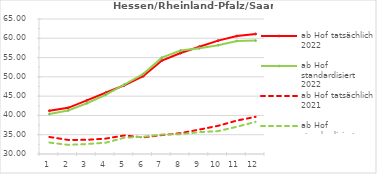
| Category | ab Hof tatsächlich 2022 | ab Hof standardisiert 2022 | ab Hof tatsächlich 2021 | ab Hof standardisiert 2021 |
|---|---|---|---|---|
| 0 | 41.209 | 40.362 | 34.411 | 32.971 |
| 1 | 41.971 | 41.272 | 33.65 | 32.369 |
| 2 | 43.896 | 43.162 | 33.671 | 32.582 |
| 3 | 45.88 | 45.363 | 33.99 | 32.934 |
| 4 | 47.817 | 48.017 | 34.814 | 34.216 |
| 5 | 50.151 | 50.736 | 34.296 | 34.459 |
| 6 | 54.241 | 54.98 | 34.905 | 35.059 |
| 7 | 56.176 | 56.822 | 35.408 | 35.143 |
| 8 | 57.817 | 57.398 | 36.336 | 35.657 |
| 9 | 59.388 | 58.221 | 37.31 | 35.943 |
| 10 | 60.575 | 59.299 | 38.668 | 37.059 |
| 11 | 61.116 | 59.402 | 39.638 | 38.337 |